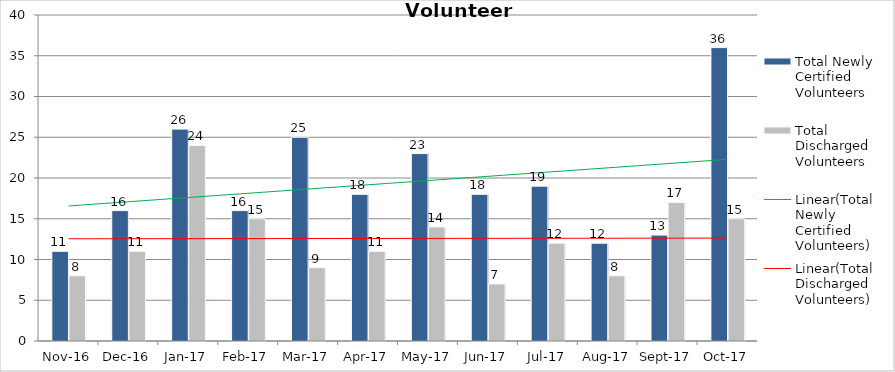
| Category | Total Newly Certified Volunteers | Total Discharged Volunteers |
|---|---|---|
| 2016-11-01 | 11 | 8 |
| 2016-12-01 | 16 | 11 |
| 2017-01-01 | 26 | 24 |
| 2017-02-01 | 16 | 15 |
| 2017-03-01 | 25 | 9 |
| 2017-04-01 | 18 | 11 |
| 2017-05-01 | 23 | 14 |
| 2017-06-01 | 18 | 7 |
| 2017-07-01 | 19 | 12 |
| 2017-08-01 | 12 | 8 |
| 2017-09-01 | 13 | 17 |
| 2017-10-01 | 36 | 15 |